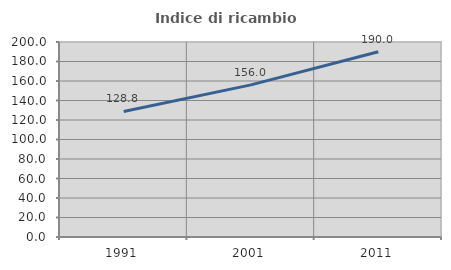
| Category | Indice di ricambio occupazionale  |
|---|---|
| 1991.0 | 128.814 |
| 2001.0 | 156 |
| 2011.0 | 190 |